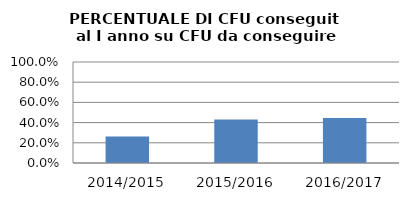
| Category | 2014/2015 2015/2016 2016/2017 |
|---|---|
| 2014/2015 | 0.262 |
| 2015/2016 | 0.43 |
| 2016/2017 | 0.445 |